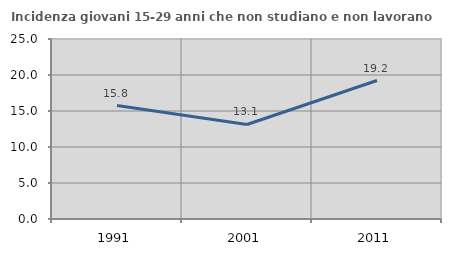
| Category | Incidenza giovani 15-29 anni che non studiano e non lavorano  |
|---|---|
| 1991.0 | 15.759 |
| 2001.0 | 13.131 |
| 2011.0 | 19.231 |